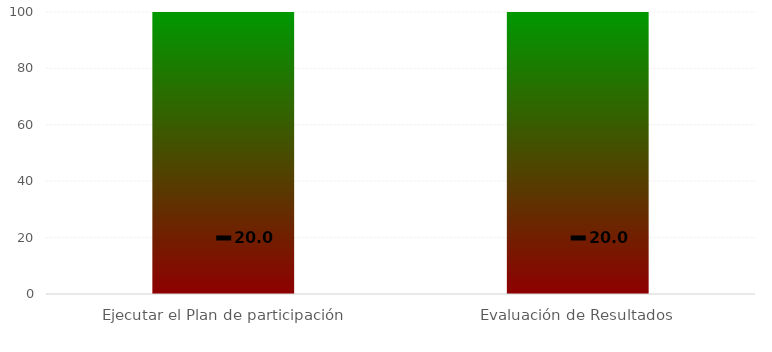
| Category | Niveles |
|---|---|
| Ejecutar el Plan de participación | 100 |
| Evaluación de Resultados | 100 |